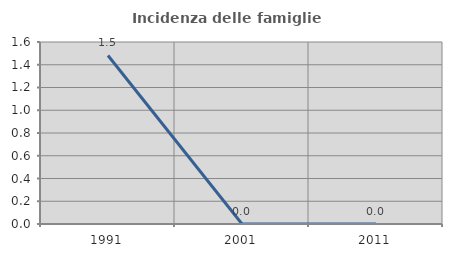
| Category | Incidenza delle famiglie numerose |
|---|---|
| 1991.0 | 1.481 |
| 2001.0 | 0 |
| 2011.0 | 0 |